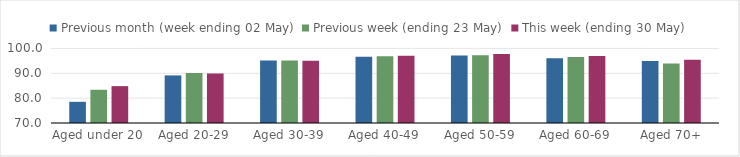
| Category | Previous month (week ending 02 May) | Previous week (ending 23 May) | This week (ending 30 May) |
|---|---|---|---|
| Aged under 20 | 78.518 | 83.372 | 84.834 |
| Aged 20-29 | 89.143 | 90.118 | 89.926 |
| Aged 30-39 | 95.149 | 95.185 | 95.049 |
| Aged 40-49 | 96.678 | 96.845 | 97.026 |
| Aged 50-59 | 97.197 | 97.227 | 97.746 |
| Aged 60-69 | 96.002 | 96.594 | 96.959 |
| Aged 70+ | 94.923 | 93.947 | 95.405 |